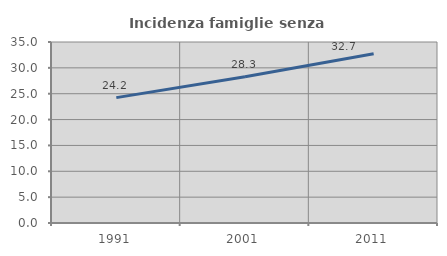
| Category | Incidenza famiglie senza nuclei |
|---|---|
| 1991.0 | 24.241 |
| 2001.0 | 28.273 |
| 2011.0 | 32.744 |